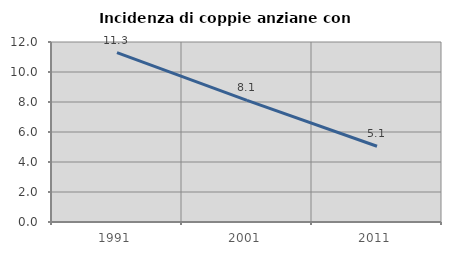
| Category | Incidenza di coppie anziane con figli |
|---|---|
| 1991.0 | 11.29 |
| 2001.0 | 8.108 |
| 2011.0 | 5.051 |